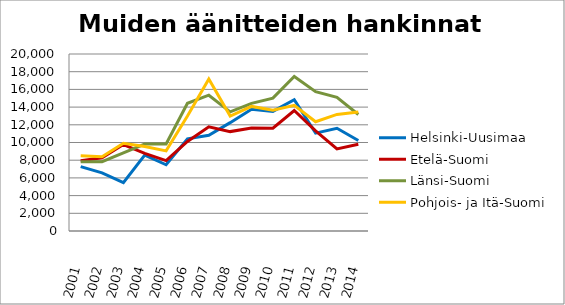
| Category | Helsinki-Uusimaa | Etelä-Suomi | Länsi-Suomi | Pohjois- ja Itä-Suomi |
|---|---|---|---|---|
| 2001.0 | 7271 | 7931 | 7816 | 8491 |
| 2002.0 | 6565 | 8273 | 7834 | 8394 |
| 2003.0 | 5457 | 9766 | 8827 | 9906 |
| 2004.0 | 8573 | 8761 | 9825 | 9556 |
| 2005.0 | 7485 | 7959 | 9833 | 9052 |
| 2006.0 | 10413 | 10118 | 14434 | 12987 |
| 2007.0 | 10822 | 11768 | 15343 | 17168 |
| 2008.0 | 12243 | 11232 | 13459 | 12995 |
| 2009.0 | 13747 | 11648 | 14427 | 14077 |
| 2010.0 | 13511 | 11616 | 15014 | 13657 |
| 2011.0 | 14835 | 13617 | 17459 | 14199 |
| 2012.0 | 11054 | 11306 | 15747 | 12347 |
| 2013.0 | 11612 | 9273 | 15111 | 13170 |
| 2014.0 | 10225 | 9797 | 13164 | 13445 |